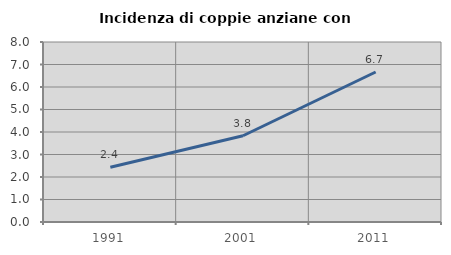
| Category | Incidenza di coppie anziane con figli |
|---|---|
| 1991.0 | 2.431 |
| 2001.0 | 3.834 |
| 2011.0 | 6.667 |